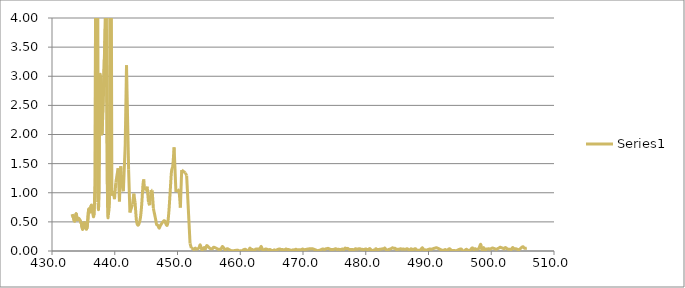
| Category | Series 0 |
|---|---|
| 433.2083333333333 | 0.63 |
| 433.4166666666667 | 0.57 |
| 433.625 | 0.515 |
| 433.8333333333333 | 0.64 |
| 434.0416666666667 | 0.54 |
| 434.25 | 0.56 |
| 434.4583333333333 | 0.525 |
| 434.6666666666667 | 0.475 |
| 434.875 | 0.37 |
| 435.0833333333333 | 0.475 |
| 435.2916666666667 | 0.47 |
| 435.4166666666667 | 0.38 |
| 435.625 | 0.425 |
| 435.8333333333333 | 0.715 |
| 436.0416666666667 | 0.665 |
| 436.25 | 0.785 |
| 436.4583333333333 | 0.685 |
| 436.6666666666667 | 0.61 |
| 436.875 | 1.115 |
| 437.125 | 12.8 |
| 437.3333333333333 | 0.84 |
| 437.4583333333333 | 0.88 |
| 437.6666666666667 | 3.015 |
| 437.9583333333333 | 2.01 |
| 438.4166666666667 | 3.56 |
| 438.625 | 4.45 |
| 438.8333333333333 | 1.01 |
| 439.0 | 0.615 |
| 439.2083333333333 | 1.02 |
| 439.3333333333333 | 9.38 |
| 439.5416666666667 | 0.95 |
| 439.75 | 1.01 |
| 439.9583333333333 | 0.89 |
| 440.1666666666667 | 1.175 |
| 440.5416666666667 | 1.42 |
| 440.75 | 0.85 |
| 440.9583333333333 | 1.455 |
| 441.1666666666667 | 1.135 |
| 441.375 | 1.025 |
| 441.6666666666667 | 1.82 |
| 441.875 | 3.19 |
| 442.2083333333333 | 1.395 |
| 442.4166666666667 | 0.66 |
| 442.8333333333333 | 0.8 |
| 443.0416666666667 | 0.985 |
| 443.25 | 0.825 |
| 443.4583333333333 | 0.52 |
| 443.6666666666667 | 0.445 |
| 443.875 | 0.47 |
| 444.0833333333333 | 0.565 |
| 444.2916666666667 | 0.79 |
| 444.5 | 1.14 |
| 444.625 | 1.23 |
| 444.75 | 1.045 |
| 444.9583333333333 | 1.04 |
| 445.1666666666667 | 1.105 |
| 445.375 | 0.835 |
| 445.5833333333333 | 0.785 |
| 445.7916666666667 | 1.045 |
| 445.9583333333333 | 1.04 |
| 446.1666666666667 | 0.725 |
| 446.5416666666667 | 0.53 |
| 446.6666666666667 | 0.455 |
| 446.875 | 0.44 |
| 447.0833333333333 | 0.39 |
| 447.2916666666667 | 0.44 |
| 447.7916666666667 | 0.515 |
| 448.0 | 0.51 |
| 448.2083333333333 | 0.45 |
| 448.4166666666667 | 0.46 |
| 448.625 | 0.675 |
| 448.8333333333333 | 1.02 |
| 449.0416666666667 | 1.365 |
| 449.25 | 1.465 |
| 449.4583333333333 | 1.78 |
| 449.75 | 1.015 |
| 449.9583333333333 | 1.055 |
| 450.25 | 1.015 |
| 450.4583333333333 | 0.746 |
| 450.6666666666667 | 1.39 |
| 451.25 | 1.34 |
| 451.4583333333333 | 1.295 |
| 452.0 | 0.13 |
| 452.2083333333333 | 0.05 |
| 452.4166666666667 | 0.04 |
| 452.625 | 0.025 |
| 452.8333333333333 | 0.05 |
| 453.0416666666667 | 0.03 |
| 453.4166666666667 | 0.055 |
| 453.625 | 0.105 |
| 453.875 | 0.02 |
| 454.0416666666667 | 0.03 |
| 454.25 | 0.06 |
| 454.4583333333333 | 0.035 |
| 454.6666666666667 | 0.095 |
| 455.1666666666667 | 0.045 |
| 455.5833333333333 | 0.04 |
| 455.7916666666667 | 0.065 |
| 456.5 | 0.03 |
| 456.7083333333333 | 0.03 |
| 456.9166666666667 | 0.03 |
| 457.1666666666667 | 0.08 |
| 457.5 | 0.03 |
| 457.7083333333333 | 0.025 |
| 457.9166666666667 | 0.04 |
| 458.125 | 0.03 |
| 458.5833333333333 | 0.005 |
| 458.9166666666667 | 0.005 |
| 459.5833333333333 | 0.015 |
| 459.7916666666667 | 0 |
| 460.0 | 0.005 |
| 460.2083333333333 | 0 |
| 460.4166666666667 | 0.015 |
| 460.75 | 0.03 |
| 460.9583333333333 | 0.02 |
| 461.0 | 0.01 |
| 461.3333333333333 | 0.01 |
| 461.5416666666667 | 0.05 |
| 461.75 | 0.025 |
| 461.9583333333333 | 0.025 |
| 462.2083333333333 | 0.005 |
| 462.4166666666667 | 0.03 |
| 462.625 | 0.035 |
| 462.875 | 0.035 |
| 463.0833333333333 | 0.03 |
| 463.3333333333333 | 0.08 |
| 463.5416666666667 | 0.025 |
| 463.6666666666667 | 0.01 |
| 463.875 | 0.025 |
| 464.0833333333333 | 0.035 |
| 464.5416666666667 | 0.02 |
| 464.75 | 0.025 |
| 465.0 | 0.01 |
| 465.2083333333333 | 0.005 |
| 465.4166666666667 | 0.02 |
| 465.625 | 0.01 |
| 465.8333333333333 | 0.02 |
| 466.0833333333333 | 0.03 |
| 466.2916666666667 | 0.035 |
| 466.5 | 0.025 |
| 466.7083333333333 | 0.025 |
| 467.0833333333333 | 0.02 |
| 467.2916666666667 | 0.035 |
| 467.5 | 0.025 |
| 467.7083333333333 | 0.025 |
| 468.2083333333333 | 0.01 |
| 468.4166666666667 | 0.02 |
| 468.625 | 0.015 |
| 468.8333333333333 | 0.03 |
| 469.0416666666667 | 0.02 |
| 469.25 | 0.02 |
| 469.4583333333333 | 0.02 |
| 469.75 | 0.025 |
| 469.9583333333333 | 0.035 |
| 470.1666666666667 | 0.02 |
| 470.375 | 0.025 |
| 471.125 | 0.04 |
| 471.25 | 0.035 |
| 471.4583333333333 | 0.04 |
| 471.875 | 0.025 |
| 472.0833333333333 | 0.015 |
| 472.2916666666667 | 0.005 |
| 472.5 | 0.01 |
| 472.7083333333333 | 0.015 |
| 472.9166666666667 | 0.025 |
| 473.1666666666667 | 0.035 |
| 473.375 | 0.025 |
| 473.5833333333333 | 0.035 |
| 473.7916666666667 | 0.04 |
| 474.0 | 0.045 |
| 474.3333333333333 | 0.03 |
| 474.5416666666667 | 0.025 |
| 475.0 | 0.03 |
| 475.2083333333333 | 0.04 |
| 475.4166666666667 | 0.025 |
| 475.625 | 0.03 |
| 476.0 | 0.025 |
| 476.2916666666667 | 0.035 |
| 476.5 | 0.025 |
| 476.7083333333333 | 0.05 |
| 476.9166666666667 | 0.04 |
| 477.125 | 0.045 |
| 477.4166666666667 | 0.025 |
| 477.9166666666667 | 0.025 |
| 478.125 | 0.02 |
| 478.375 | 0.04 |
| 478.5833333333333 | 0.03 |
| 479.0 | 0.04 |
| 479.2083333333333 | 0.03 |
| 479.4166666666667 | 0.03 |
| 479.625 | 0.025 |
| 479.8333333333333 | 0.03 |
| 480.0416666666667 | 0.035 |
| 480.25 | 0.02 |
| 480.4583333333333 | 0.03 |
| 480.6666666666667 | 0.04 |
| 481.0 | 0 |
| 481.2083333333333 | 0.015 |
| 481.4166666666667 | 0.015 |
| 481.625 | 0.04 |
| 481.8333333333333 | 0.025 |
| 482.8333333333333 | 0.04 |
| 483.0416666666667 | 0.05 |
| 483.3333333333333 | 0.01 |
| 483.5416666666667 | 0.02 |
| 483.75 | 0.03 |
| 484.0416666666667 | 0.04 |
| 484.25 | 0.055 |
| 484.5 | 0.045 |
| 484.7083333333333 | 0.045 |
| 484.9166666666667 | 0.02 |
| 485.125 | 0.03 |
| 485.3333333333333 | 0.03 |
| 485.5416666666667 | 0.04 |
| 485.75 | 0.03 |
| 485.9583333333333 | 0.035 |
| 486.1666666666667 | 0.03 |
| 486.375 | 0.03 |
| 486.5833333333333 | 0.04 |
| 486.7916666666667 | 0.025 |
| 487.0 | 0.01 |
| 487.2083333333333 | 0.04 |
| 487.4166666666667 | 0.015 |
| 487.5 | 0.03 |
| 487.7083333333333 | 0.03 |
| 487.9166666666667 | 0.04 |
| 488.2083333333333 | 0.01 |
| 488.4166666666667 | 0.015 |
| 488.625 | 0.01 |
| 488.8333333333333 | 0.035 |
| 489.0416666666667 | 0.055 |
| 489.25 | 0.015 |
| 489.4583333333333 | 0.02 |
| 489.6666666666667 | 0.015 |
| 490.2083333333333 | 0.035 |
| 490.4166666666667 | 0.03 |
| 491.2083333333333 | 0.055 |
| 491.4166666666667 | 0.05 |
| 492.25 | 0.01 |
| 492.4583333333333 | 0.015 |
| 492.6666666666667 | 0.025 |
| 492.9583333333333 | 0.01 |
| 493.3333333333333 | 0.04 |
| 493.6666666666667 | 0.01 |
| 494.0833333333333 | 0.01 |
| 494.4166666666667 | 0.005 |
| 494.8333333333333 | 0.025 |
| 495.2083333333333 | 0.035 |
| 495.4166666666667 | 0.01 |
| 495.625 | 0 |
| 495.8333333333333 | 0.015 |
| 496.0416666666667 | 0.03 |
| 496.25 | 0.015 |
| 496.4583333333333 | 0.005 |
| 496.6666666666667 | 0.02 |
| 497.0 | 0.055 |
| 497.2083333333333 | 0.02 |
| 497.4166666666667 | 0.04 |
| 497.625 | 0.03 |
| 498.0 | 0.04 |
| 498.3333333333333 | 0.115 |
| 498.5416666666667 | 0.01 |
| 498.7916666666667 | 0.06 |
| 499.0 | 0.01 |
| 499.2083333333333 | 0.035 |
| 499.4166666666667 | 0.035 |
| 499.625 | 0.04 |
| 499.75 | 0.03 |
| 500.0416666666667 | 0.045 |
| 500.25 | 0.05 |
| 500.7916666666667 | 0.03 |
| 501.0 | 0.04 |
| 501.2083333333333 | 0.05 |
| 501.4166666666667 | 0.065 |
| 501.625 | 0.055 |
| 501.8333333333333 | 0.05 |
| 502.0416666666667 | 0.035 |
| 502.25 | 0.06 |
| 502.5833333333333 | 0.035 |
| 503.0 | 0.03 |
| 503.2083333333333 | 0.025 |
| 503.4166666666667 | 0.06 |
| 503.625 | 0.04 |
| 503.8333333333333 | 0.04 |
| 504.0416666666667 | 0.035 |
| 504.25 | 0.025 |
| 504.4583333333333 | 0.025 |
| 504.6666666666667 | 0.045 |
| 505.0416666666667 | 0.075 |
| 505.25 | 0.05 |
| 505.4583333333333 | 0.045 |
| 505.6666666666667 | 0.05 |